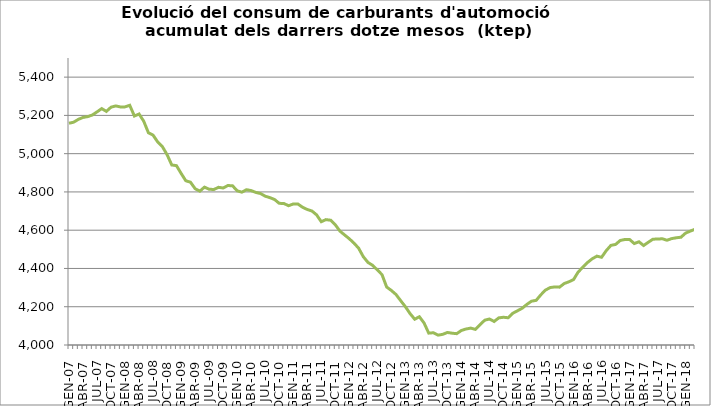
| Category | Series 0 |
|---|---|
| GEN-07 | 5158.998 |
| FEB-07 | 5164.573 |
| MAR-07 | 5179.385 |
| ABR-07 | 5189.297 |
| MAI-07 | 5193.612 |
| JUN-07 | 5201.932 |
| JUL-07 | 5218.403 |
| AGO-07 | 5235.445 |
| SET-07 | 5221 |
| OCT-07 | 5242.991 |
| NOV-07 | 5249.496 |
| DES-07 | 5244.277 |
| GEN-08 | 5244.547 |
| FEB-08 | 5252.736 |
| MAR-08 | 5196.741 |
| ABR-08 | 5207.345 |
| MAI-08 | 5169.401 |
| JUN-08 | 5109.143 |
| JUL-08 | 5096.724 |
| AGO-08 | 5060.448 |
| SET-08 | 5036.409 |
| OCT-08 | 4994.566 |
| NOV-08 | 4940.813 |
| DES-08 | 4937.532 |
| GEN-09 | 4896.915 |
| FEB-09 | 4858.419 |
| MAR-09 | 4850.987 |
| ABR-09 | 4816.926 |
| MAI-09 | 4804.08 |
| JUN-09 | 4825.085 |
| JUL-09 | 4814.078 |
| AGO-09 | 4812.702 |
| SET-09 | 4824.025 |
| OCT-09 | 4820.664 |
| NOV-09 | 4833.305 |
| DES-09 | 4832.404 |
| GEN-10 | 4805.792 |
| FEB-10 | 4798.859 |
| MAR-10 | 4811.659 |
| ABR-10 | 4806.989 |
| MAI-10 | 4797.327 |
| JUN-10 | 4791.642 |
| JUL-10 | 4777.758 |
| AGO-10 | 4770.303 |
| SET-10 | 4760.438 |
| OCT-10 | 4740.43 |
| NOV-10 | 4739.508 |
| DES-10 | 4728.006 |
| GEN-11 | 4736.973 |
| FEB-11 | 4736.775 |
| MAR-11 | 4719.907 |
| ABR-11 | 4708.248 |
| MAI-11 | 4700.431 |
| JUN-11 | 4680.147 |
| JUL-11 | 4644.382 |
| AGO-11 | 4655.302 |
| SET-11 | 4652.149 |
| OCT-11 | 4628.312 |
| NOV-11 | 4595.133 |
| DES-11 | 4575.131 |
| GEN-12 | 4555.145 |
| FEB-12 | 4532.659 |
| MAR-12 | 4505.699 |
| ABR-12 | 4461.35 |
| MAI-12 | 4431.428 |
| JUN-12 | 4416.381 |
| JUL-12 | 4392.37 |
| AGO-12 | 4367.79 |
| SET-12 | 4302.877 |
| OCT-12 | 4285.059 |
| NOV-12 | 4263.826 |
| DES-12 | 4231.622 |
| GEN-13 | 4200.241 |
| FEB-13 | 4164.385 |
| MAR-13 | 4134.67 |
| ABR-13 | 4147.818 |
| MAI-13 | 4115.128 |
| JUN-13 | 4062.104 |
| JUL-13 | 4064.006 |
| AGO-13 | 4051.433 |
| SET-13 | 4055.744 |
| OCT-13 | 4065.596 |
| NOV-13 | 4061.59 |
| DES-13 | 4059.249 |
| GEN-14 | 4076.114 |
| FEB-14 | 4083.712 |
| MAR-14 | 4088.194 |
| ABR-14 | 4081.59 |
| MAI-14 | 4106.676 |
| JUN-14 | 4129.792 |
| JUL-14 | 4135.849 |
| AGO-14 | 4123.031 |
| SET-14 | 4141.8 |
| OCT-14 | 4144.908 |
| NOV-14 | 4142.428 |
| DES-14 | 4165.927 |
| GEN-15 | 4178.839 |
| FEB-15 | 4191.925 |
| MAR-15 | 4212.041 |
| ABR-15 | 4228.982 |
| MAI-15 | 4233.297 |
| JUN-15 | 4262.365 |
| JUL-15 | 4286.986 |
| AGO-15 | 4300.209 |
| SET-15 | 4303.562 |
| OCT-15 | 4302.336 |
| NOV-15 | 4321.198 |
| DES-15 | 4330.282 |
| GEN-16 | 4341.783 |
| FEB-16 | 4381.781 |
| MAR-16 | 4406.616 |
| ABR-16 | 4431.259 |
| MAI-16 | 4450.631 |
| JUN-16 | 4464.288 |
| JUL-16 | 4458.483 |
| AGO-16 | 4493.027 |
| SET-16 | 4520.774 |
| OCT-16 | 4525.551 |
| NOV-16 | 4546.397 |
| DES-16 | 4551.485 |
| GEN-17 | 4551.431 |
| FEB-17 | 4530.227 |
| MAR-17 | 4539.45 |
| ABR-17 | 4519.87 |
| MAI-17 | 4536.999 |
| JUN-17 | 4553.017 |
| JUL-17 | 4553.874 |
| AGO-17 | 4555.178 |
| SET-17 | 4547.547 |
| OCT-17 | 4556.046 |
| NOV-17 | 4560.414 |
| DES-17 | 4563.41 |
| GEN-18 | 4585.108 |
| FEB-18 | 4595.196 |
| MAR-18 | 4605.174 |